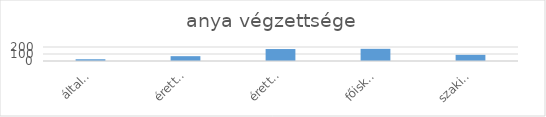
| Category | Series 0 |
|---|---|
| általános iskola | 25 |
| érettségi | 69 |
| érettségi+szakma | 171 |
| főiskola/egyetem | 174 |
| szakiskola | 88 |